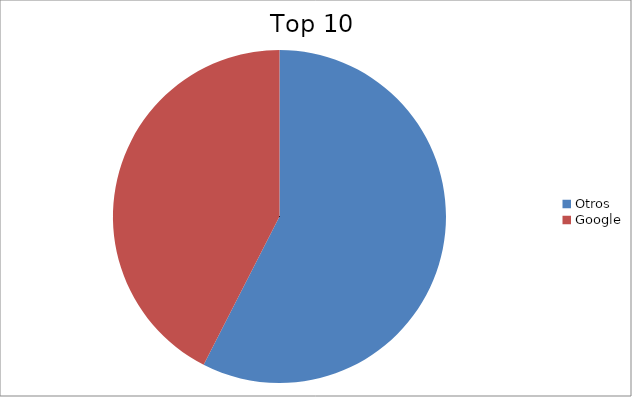
| Category | Series 0 |
|---|---|
| Otros | 57.53 |
| Google | 42.47 |